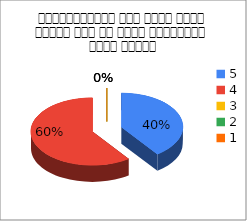
| Category | महाविद्यालय में आपको मिले कार्य भार से अपनी संतुष्टि स्तर बताइए |
|---|---|
| 5.0 | 4 |
| 4.0 | 6 |
| 3.0 | 0 |
| 2.0 | 0 |
| 1.0 | 0 |